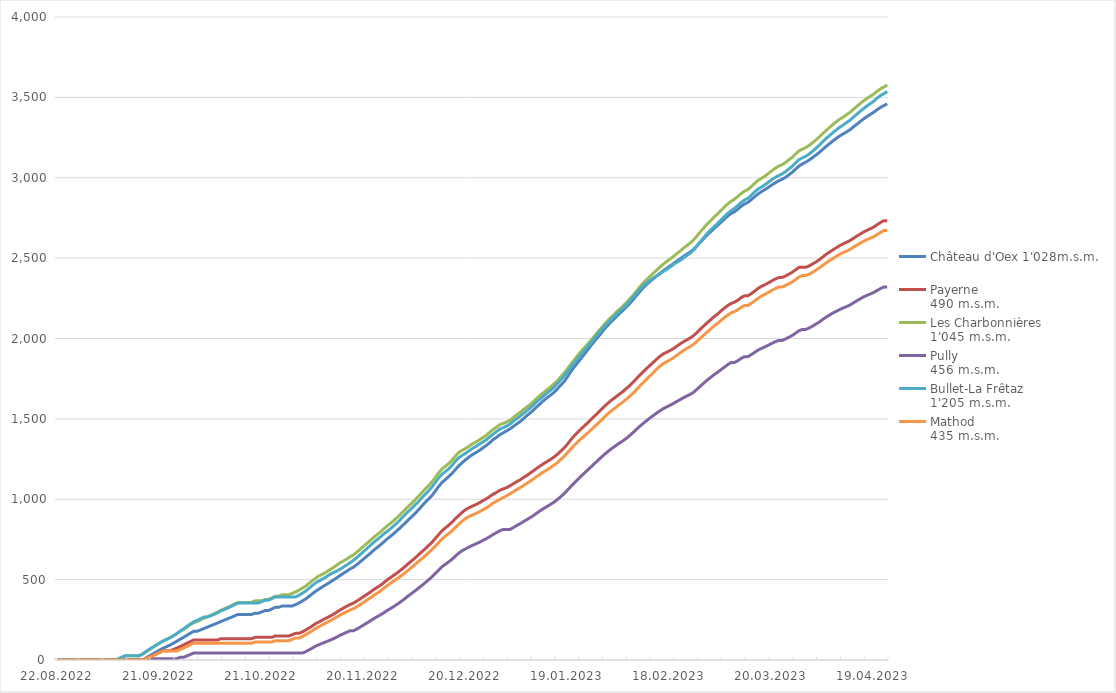
| Category | Château d'Oex 1'028m.s.m. | Payerne 
490 m.s.m. | Les Charbonnières 
1'045 m.s.m. | Pully 
456 m.s.m. | Bullet-La Frêtaz 
1'205 m.s.m. | Mathod 
435 m.s.m. |
|---|---|---|---|---|---|---|
| 22.08.2022 | 0 | 0 | 0 | 0 | 0 | 0 |
| 23.08.2022 | 0 | 0 | 0 | 0 | 0 | 0 |
| 24.08.2022 | 0 | 0 | 0 | 0 | 0 | 0 |
| 25.08.2022 | 0 | 0 | 0 | 0 | 0 | 0 |
| 26.08.2022 | 0 | 0 | 0 | 0 | 0 | 0 |
| 27.08.2022 | 0 | 0 | 0 | 0 | 0 | 0 |
| 28.08.2022 | 0 | 0 | 0 | 0 | 0 | 0 |
| 29.08.2022 | 0 | 0 | 0 | 0 | 0 | 0 |
| 30.08.2022 | 0 | 0 | 0 | 0 | 0 | 0 |
| 31.08.2022 | 0 | 0 | 0 | 0 | 0 | 0 |
| 01.09.2022 | 0 | 0 | 0 | 0 | 0 | 0 |
| 02.09.2022 | 0 | 0 | 0 | 0 | 0 | 0 |
| 03.09.2022 | 0 | 0 | 0 | 0 | 0 | 0 |
| 04.09.2022 | 0 | 0 | 0 | 0 | 0 | 0 |
| 05.09.2022 | 0 | 0 | 0 | 0 | 0 | 0 |
| 06.09.2022 | 0 | 0 | 0 | 0 | 0 | 0 |
| 07.09.2022 | 0 | 0 | 0 | 0 | 0 | 0 |
| 08.09.2022 | 0 | 0 | 0 | 0 | 0 | 0 |
| 09.09.2022 | 0 | 0 | 8.3 | 0 | 8.8 | 0 |
| 10.09.2022 | 0 | 0 | 17.5 | 0 | 18.7 | 0 |
| 11.09.2022 | 0 | 0 | 26.4 | 0 | 27 | 0 |
| 12.09.2022 | 0 | 0 | 26.4 | 0 | 27 | 0 |
| 13.09.2022 | 0 | 0 | 26.4 | 0 | 27 | 0 |
| 14.09.2022 | 0 | 0 | 26.4 | 0 | 27 | 0 |
| 15.09.2022 | 0 | 0 | 26.4 | 0 | 27 | 0 |
| 16.09.2022 | 0 | 0 | 36.5 | 0 | 37.9 | 0 |
| 17.09.2022 | 13.1 | 9.8 | 51.7 | 8.3 | 53.3 | 9 |
| 18.09.2022 | 25.5 | 18.8 | 65.4 | 8.3 | 66.5 | 18 |
| 19.09.2022 | 37.2 | 27.6 | 79.4 | 8.3 | 79.7 | 26.8 |
| 20.09.2022 | 49.7 | 37.2 | 92.1 | 8.3 | 92.7 | 36.7 |
| 21.09.2022 | 62.1 | 47.2 | 105 | 8.3 | 105.8 | 46.1 |
| 22.09.2022 | 73.5 | 57.5 | 117.9 | 8.3 | 118.2 | 56 |
| 23.09.2022 | 82.7 | 57.5 | 128.2 | 8.3 | 127.7 | 56 |
| 24.09.2022 | 92.6 | 57.5 | 138.1 | 8.3 | 138.7 | 56 |
| 25.09.2022 | 104.3 | 65.6 | 150.1 | 8.3 | 151 | 56 |
| 26.09.2022 | 115.9 | 73.9 | 162.9 | 8.3 | 164.4 | 56 |
| 27.09.2022 | 129.2 | 83.7 | 177.3 | 16.4 | 179.8 | 65.4 |
| 28.09.2022 | 140.7 | 93.3 | 189.9 | 16.4 | 193.7 | 74.2 |
| 29.09.2022 | 153.9 | 104 | 204.2 | 25.3 | 208.7 | 84.2 |
| 30.09.2022 | 166.9 | 114.8 | 219.3 | 34.4 | 224.2 | 94.8 |
| 01.10.2022 | 178.1 | 124.2 | 231.8 | 43 | 237.2 | 104.1 |
| 02.10.2022 | 178.1 | 124.2 | 240 | 43 | 246.2 | 104.1 |
| 03.10.2022 | 187.1 | 124.2 | 249.8 | 43 | 257.1 | 104.1 |
| 04.10.2022 | 196 | 124.2 | 259.5 | 43 | 266.9 | 104.1 |
| 05.10.2022 | 204.4 | 124.2 | 269.1 | 43 | 266.9 | 104.1 |
| 06.10.2022 | 213.1 | 124.2 | 278.4 | 43 | 274.9 | 104.1 |
| 07.10.2022 | 221.6 | 124.2 | 287.5 | 43 | 283.7 | 104.1 |
| 08.10.2022 | 230.2 | 124.2 | 298.3 | 43 | 293.6 | 104.1 |
| 09.10.2022 | 239.5 | 132.6 | 309.2 | 43 | 305.6 | 104.1 |
| 10.10.2022 | 248 | 132.6 | 318.3 | 43 | 314.3 | 104.1 |
| 11.10.2022 | 256.9 | 132.6 | 327.6 | 43 | 323.2 | 104.1 |
| 12.10.2022 | 265 | 132.6 | 337.5 | 43 | 333.5 | 104.1 |
| 13.10.2022 | 274.9 | 132.6 | 348.5 | 43 | 343.8 | 104.1 |
| 14.10.2022 | 283 | 132.6 | 357.9 | 43 | 354 | 104.1 |
| 15.10.2022 | 283 | 132.6 | 357.9 | 43 | 354 | 104.1 |
| 16.10.2022 | 283 | 132.6 | 357.9 | 43 | 354 | 104.1 |
| 17.10.2022 | 283 | 132.6 | 357.9 | 43 | 354 | 104.1 |
| 18.10.2022 | 283 | 132.6 | 357.9 | 43 | 354 | 104.1 |
| 19.10.2022 | 291.2 | 140.9 | 367.9 | 43 | 354 | 112.2 |
| 20.10.2022 | 291.2 | 140.9 | 367.9 | 43 | 354 | 112.2 |
| 21.10.2022 | 299.3 | 140.9 | 367.9 | 43 | 363 | 112.2 |
| 22.10.2022 | 307.8 | 140.9 | 376.6 | 43 | 372.1 | 112.2 |
| 23.10.2022 | 307.8 | 140.9 | 376.6 | 43 | 372.1 | 112.2 |
| 24.10.2022 | 317.3 | 140.9 | 385.9 | 43 | 382.2 | 112.2 |
| 25.10.2022 | 327.8 | 149.7 | 397 | 43 | 392.6 | 120.3 |
| 26.10.2022 | 327.8 | 149.7 | 397 | 43 | 392.6 | 120.3 |
| 27.10.2022 | 336 | 149.7 | 405.4 | 43 | 392.6 | 120.3 |
| 28.10.2022 | 336 | 149.7 | 405.4 | 43 | 392.6 | 120.3 |
| 29.10.2022 | 336 | 149.7 | 405.4 | 43 | 392.6 | 120.3 |
| 30.10.2022 | 336 | 157.8 | 414.9 | 43 | 392.6 | 129 |
| 31.10.2022 | 345.1 | 166 | 424.2 | 43 | 392.6 | 137.6 |
| 01.11.2022 | 354.9 | 166 | 434.9 | 43 | 403.3 | 137.6 |
| 02.11.2022 | 367.6 | 175.2 | 447.9 | 43 | 416.2 | 146.1 |
| 03.11.2022 | 380.7 | 187.3 | 460.9 | 52.4 | 429.8 | 158.2 |
| 04.11.2022 | 396.9 | 199.9 | 478.1 | 63.6 | 447.6 | 170.6 |
| 05.11.2022 | 413.8 | 213.3 | 495.7 | 75.6 | 465.8 | 183.7 |
| 06.11.2022 | 429.5 | 228.2 | 511.3 | 87.5 | 481.6 | 198 |
| 07.11.2022 | 443.6 | 238.3 | 524.8 | 96.6 | 494.3 | 209 |
| 08.11.2022 | 457.1 | 250.3 | 535.1 | 105.5 | 505.1 | 221.3 |
| 09.11.2022 | 470.1 | 260.8 | 546.9 | 114 | 517.8 | 231.3 |
| 10.11.2022 | 482.8 | 271.6 | 561 | 122.2 | 531.6 | 242.3 |
| 11.11.2022 | 496.8 | 283.6 | 574.2 | 131.5 | 543.1 | 254.3 |
| 12.11.2022 | 510 | 296.5 | 589 | 142 | 552.5 | 266.4 |
| 13.11.2022 | 524.7 | 310.5 | 604 | 153.6 | 564.1 | 279.2 |
| 14.11.2022 | 538.9 | 322.5 | 615.6 | 162.7 | 577.5 | 289.7 |
| 15.11.2022 | 552.2 | 334.3 | 628 | 172.5 | 591.6 | 300.6 |
| 16.11.2022 | 566.1 | 344.9 | 641.6 | 181.8 | 605.9 | 311.1 |
| 17.11.2022 | 577.6 | 354.1 | 654.4 | 181.8 | 619.7 | 319.4 |
| 18.11.2022 | 593.4 | 366.7 | 671.3 | 192.7 | 637.3 | 331.1 |
| 19.11.2022 | 611.4 | 380.8 | 689.6 | 205.3 | 656.1 | 344.9 |
| 20.11.2022 | 629.5 | 395.1 | 708.7 | 218 | 675.5 | 359.7 |
| 21.11.2022 | 646.2 | 408.9 | 726.4 | 230.9 | 694.1 | 373.3 |
| 22.11.2022 | 664.5 | 423 | 745.3 | 243.9 | 713.7 | 387.3 |
| 23.11.2022 | 684.1 | 438.7 | 763.7 | 258 | 732.7 | 403.1 |
| 24.11.2022 | 700.9 | 452 | 781.1 | 269.9 | 750.2 | 416.1 |
| 25.11.2022 | 717.8 | 465.9 | 798.4 | 281.9 | 767 | 430.3 |
| 26.11.2022 | 736.3 | 482.8 | 817.8 | 294.8 | 785.5 | 447.5 |
| 27.11.2022 | 755.1 | 499.6 | 836.1 | 309.2 | 802.1 | 464.1 |
| 28.11.2022 | 771.4 | 514.4 | 852.1 | 321.6 | 818.9 | 479.1 |
| 29.11.2022 | 789.5 | 529.4 | 870.6 | 334.9 | 837.5 | 493.8 |
| 30.11.2022 | 808.1 | 544.3 | 889.2 | 348.6 | 856.7 | 507.5 |
| 01.12.2022 | 827.9 | 561 | 910.3 | 364.2 | 878.5 | 523.3 |
| 02.12.2022 | 848 | 578 | 931.1 | 379.6 | 900.3 | 539.4 |
| 03.12.2022 | 868.9 | 597.2 | 953.1 | 397 | 921.6 | 557.2 |
| 04.12.2022 | 888.8 | 615 | 972.9 | 412.9 | 940.5 | 574 |
| 05.12.2022 | 909.1 | 632.5 | 993.9 | 428.5 | 961.8 | 592.2 |
| 06.12.2022 | 931.6 | 652.4 | 1015.9 | 445 | 982.6 | 610.8 |
| 07.12.2022 | 955.1 | 671.5 | 1038.7 | 462 | 1006.2 | 628.6 |
| 08.12.2022 | 978.7 | 690.3 | 1061.6 | 478.8 | 1029.3 | 646.8 |
| 09.12.2022 | 999.4 | 710.3 | 1082.5 | 497.3 | 1050.4 | 666.3 |
| 10.12.2022 | 1021 | 730.3 | 1106 | 515.5 | 1074.4 | 685.4 |
| 11.12.2022 | 1048.9 | 754.4 | 1134.2 | 536.5 | 1102.4 | 707.1 |
| 12.12.2022 | 1078.6 | 779 | 1162.7 | 558 | 1131 | 729.8 |
| 13.12.2022 | 1103.4 | 803.1 | 1188.4 | 579.4 | 1155.6 | 752.6 |
| 14.12.2022 | 1121.8 | 821.4 | 1204.3 | 595.5 | 1171.9 | 770.8 |
| 15.12.2022 | 1141 | 838.6 | 1222.7 | 610.2 | 1189.3 | 786.7 |
| 16.12.2022 | 1161.4 | 857.9 | 1243.5 | 626.9 | 1211 | 804.3 |
| 17.12.2022 | 1185 | 879.6 | 1269.3 | 647.1 | 1237.8 | 825 |
| 18.12.2022 | 1208.9 | 900.2 | 1292.5 | 665.4 | 1258.8 | 845.1 |
| 19.12.2022 | 1228.3 | 919.1 | 1305 | 680.4 | 1273.6 | 863.8 |
| 20.12.2022 | 1246.2 | 936.3 | 1316.5 | 691.7 | 1286.5 | 881.1 |
| 21.12.2022 | 1263.2 | 947.5 | 1330.2 | 702.8 | 1301.2 | 892.9 |
| 22.12.2022 | 1277.6 | 957.8 | 1344.4 | 713.2 | 1316.4 | 902.8 |
| 23.12.2022 | 1290.2 | 966.8 | 1355.9 | 722.7 | 1328.6 | 911.6 |
| 24.12.2022 | 1303.5 | 977.8 | 1369.3 | 732.1 | 1342.7 | 921.5 |
| 25.12.2022 | 1318.4 | 990.2 | 1383.3 | 743.5 | 1355.5 | 934 |
| 26.12.2022 | 1333.7 | 1002.2 | 1397.2 | 754.3 | 1369.8 | 945.6 |
| 27.12.2022 | 1350.7 | 1015.8 | 1415.7 | 766.2 | 1387.8 | 958.9 |
| 28.12.2022 | 1369.8 | 1030.7 | 1432.7 | 779.7 | 1404 | 975.3 |
| 29.12.2022 | 1384.3 | 1042.2 | 1447.8 | 791.4 | 1419.8 | 986.7 |
| 30.12.2022 | 1400.5 | 1055.2 | 1463.1 | 803.6 | 1436.1 | 998.8 |
| 31.12.2022 | 1413.1 | 1063.9 | 1471.5 | 812 | 1445.2 | 1010 |
| 01.01.2023 | 1424.6 | 1072 | 1480.1 | 812 | 1454.9 | 1021.1 |
| 02.01.2023 | 1437.2 | 1083.2 | 1490.8 | 812 | 1467.6 | 1033.3 |
| 03.01.2023 | 1452.4 | 1096.3 | 1507.7 | 824 | 1484.9 | 1046.5 |
| 04.01.2023 | 1468.6 | 1109.3 | 1525.4 | 836.3 | 1501.6 | 1059.9 |
| 05.01.2023 | 1483.2 | 1120.8 | 1540 | 847.9 | 1516.7 | 1071.8 |
| 06.01.2023 | 1501.3 | 1135.1 | 1558.2 | 861 | 1534.1 | 1085.7 |
| 07.01.2023 | 1520.4 | 1148.3 | 1574.3 | 873.5 | 1550.7 | 1099.2 |
| 08.01.2023 | 1537.6 | 1162.8 | 1589.6 | 886 | 1567.7 | 1112.8 |
| 09.01.2023 | 1556.4 | 1178.1 | 1609.2 | 900 | 1588 | 1127.5 |
| 10.01.2023 | 1576.8 | 1194 | 1629.5 | 915.1 | 1608.7 | 1142.8 |
| 11.01.2023 | 1596 | 1208.4 | 1647.3 | 929.6 | 1625.9 | 1157.6 |
| 12.01.2023 | 1615.5 | 1222.4 | 1665 | 943.4 | 1643.8 | 1171.5 |
| 13.01.2023 | 1632.3 | 1235.4 | 1682.4 | 955.8 | 1662 | 1184.3 |
| 14.01.2023 | 1648.2 | 1248.2 | 1699.3 | 968.8 | 1678.1 | 1197.8 |
| 15.01.2023 | 1665.6 | 1262.8 | 1718.2 | 982.6 | 1697.7 | 1212 |
| 16.01.2023 | 1687.9 | 1280.4 | 1739.3 | 998.8 | 1719.8 | 1229.2 |
| 17.01.2023 | 1710.1 | 1300.1 | 1761.7 | 1017 | 1743 | 1248.2 |
| 18.01.2023 | 1733.3 | 1319.9 | 1785.9 | 1036.1 | 1768 | 1267.6 |
| 19.01.2023 | 1764.3 | 1345 | 1813.9 | 1058.3 | 1795.7 | 1291.5 |
| 20.01.2023 | 1796.1 | 1371.8 | 1842.7 | 1081.2 | 1823.4 | 1315 |
| 21.01.2023 | 1825.1 | 1396.4 | 1869.7 | 1103.2 | 1850.5 | 1336.8 |
| 22.01.2023 | 1851.8 | 1417.7 | 1895.6 | 1123.8 | 1877.3 | 1357.2 |
| 23.01.2023 | 1878 | 1438.7 | 1921 | 1144.4 | 1903.3 | 1377.3 |
| 24.01.2023 | 1905.7 | 1458.1 | 1944.5 | 1164.5 | 1927.4 | 1395.9 |
| 25.01.2023 | 1932.6 | 1478.1 | 1968.3 | 1184.2 | 1951.8 | 1414.9 |
| 26.01.2023 | 1960 | 1498.7 | 1993.1 | 1204.2 | 1977.6 | 1434.6 |
| 27.01.2023 | 1986.4 | 1519.5 | 2018.6 | 1224.2 | 2003.7 | 1454.6 |
| 28.01.2023 | 2011.6 | 1539.8 | 2043.7 | 1243.8 | 2029.5 | 1473.9 |
| 29.01.2023 | 2038 | 1560.7 | 2068.7 | 1263.7 | 2055.7 | 1494 |
| 30.01.2023 | 2063.4 | 1581.7 | 2093.6 | 1282.6 | 2079.3 | 1515.7 |
| 31.01.2023 | 2086.4 | 1600.9 | 2116 | 1299.8 | 2101.6 | 1535.6 |
| 01.02.2023 | 2108.4 | 1618.1 | 2137.3 | 1316.4 | 2123.2 | 1552.7 |
| 02.02.2023 | 2128.9 | 1634 | 2157.5 | 1331.3 | 2144 | 1568.8 |
| 03.02.2023 | 2150.8 | 1650.6 | 2177.6 | 1346.6 | 2164.1 | 1585.5 |
| 04.02.2023 | 2170.3 | 1666.2 | 2195.8 | 1359.8 | 2182.8 | 1600.9 |
| 05.02.2023 | 2190.9 | 1684.7 | 2217.6 | 1375 | 2203.8 | 1618.8 |
| 06.02.2023 | 2212.1 | 1702.5 | 2239.9 | 1391.7 | 2226.9 | 1635.8 |
| 07.02.2023 | 2235.6 | 1722.8 | 2263.6 | 1410.3 | 2251.1 | 1655.5 |
| 08.02.2023 | 2261.6 | 1745 | 2289.3 | 1430.4 | 2277.4 | 1676.7 |
| 09.02.2023 | 2286.5 | 1767.4 | 2315.1 | 1449.8 | 2301.3 | 1699.4 |
| 10.02.2023 | 2310.9 | 1789 | 2340.6 | 1468 | 2324.3 | 1721.7 |
| 11.02.2023 | 2332.5 | 1809.6 | 2362.8 | 1485.7 | 2341.9 | 1742.9 |
| 12.02.2023 | 2351.6 | 1829.1 | 2382.4 | 1502 | 2359 | 1763.2 |
| 13.02.2023 | 2368.9 | 1848.4 | 2402.4 | 1518.1 | 2373.4 | 1784 |
| 14.02.2023 | 2386.3 | 1868.3 | 2422.3 | 1533.6 | 2387.6 | 1805.8 |
| 15.02.2023 | 2403 | 1887 | 2441.5 | 1548.4 | 2400.6 | 1825.6 |
| 16.02.2023 | 2419.8 | 1902.9 | 2460.7 | 1562.1 | 2415 | 1842.5 |
| 17.02.2023 | 2434.8 | 1913.1 | 2477.1 | 1573.2 | 2429 | 1854.5 |
| 18.02.2023 | 2449.7 | 1923.9 | 2492.3 | 1583.8 | 2442.8 | 1865.6 |
| 19.02.2023 | 2464.5 | 1935.8 | 2508.5 | 1594.7 | 2458.6 | 1878.1 |
| 20.02.2023 | 2480.1 | 1951 | 2526.1 | 1606.9 | 2473 | 1894.3 |
| 21.02.2023 | 2494.5 | 1965.4 | 2542.8 | 1618.9 | 2485 | 1910.2 |
| 22.02.2023 | 2509.7 | 1979.1 | 2560.8 | 1631.1 | 2499.8 | 1925.1 |
| 23.02.2023 | 2523.9 | 1991.2 | 2577 | 1641.7 | 2515.4 | 1937.8 |
| 24.02.2023 | 2537.7 | 2003 | 2593.4 | 1652.3 | 2530.2 | 1949.9 |
| 25.02.2023 | 2554 | 2017 | 2612.5 | 1665 | 2549.7 | 1962.9 |
| 26.02.2023 | 2576.6 | 2037.1 | 2637.2 | 1684 | 2575.3 | 1981.8 |
| 27.02.2023 | 2599 | 2057.6 | 2662.6 | 1703.1 | 2601.3 | 2001.3 |
| 28.02.2023 | 2621.3 | 2077.8 | 2687.4 | 1722 | 2627.2 | 2020.7 |
| 01.03.2023 | 2642.9 | 2097.4 | 2711.8 | 1740.6 | 2652.4 | 2039.7 |
| 02.03.2023 | 2663.1 | 2115.7 | 2733.1 | 1757.4 | 2674.7 | 2057.6 |
| 03.03.2023 | 2683.7 | 2135.1 | 2754.1 | 1774.1 | 2694.9 | 2077.2 |
| 04.03.2023 | 2701.8 | 2150.5 | 2772.4 | 1788.4 | 2713.8 | 2092 |
| 05.03.2023 | 2721.6 | 2169.8 | 2793.9 | 1804.7 | 2734.7 | 2110.8 |
| 06.03.2023 | 2741 | 2187.5 | 2815.7 | 1820.5 | 2756 | 2129 |
| 07.03.2023 | 2760.8 | 2204 | 2836 | 1836.3 | 2777.2 | 2145.3 |
| 08.03.2023 | 2776.8 | 2217.4 | 2852.4 | 1850 | 2794.6 | 2158.7 |
| 09.03.2023 | 2788.1 | 2225.6 | 2865.8 | 1850 | 2808.4 | 2166.8 |
| 10.03.2023 | 2803.8 | 2237.7 | 2883 | 1861.3 | 2826.4 | 2178.4 |
| 11.03.2023 | 2821.9 | 2254.3 | 2901.2 | 1876.2 | 2845.9 | 2194.3 |
| 12.03.2023 | 2836.8 | 2265.9 | 2916.6 | 1887 | 2861.5 | 2205.8 |
| 13.03.2023 | 2846.8 | 2265.9 | 2926.8 | 1887 | 2872.1 | 2205.8 |
| 14.03.2023 | 2863.9 | 2279.2 | 2944.7 | 1899.7 | 2890.8 | 2218.7 |
| 15.03.2023 | 2882.5 | 2295.2 | 2965.4 | 1913.9 | 2912.1 | 2234.1 |
| 16.03.2023 | 2899.6 | 2311.7 | 2983.7 | 1928 | 2929.8 | 2250.4 |
| 17.03.2023 | 2913.5 | 2324.6 | 2996.3 | 1938.5 | 2942.4 | 2264 |
| 18.03.2023 | 2926.3 | 2334.8 | 3009.9 | 1947.7 | 2955.9 | 2275.3 |
| 19.03.2023 | 2940.2 | 2345.8 | 3026.2 | 1958.1 | 2971.6 | 2286.6 |
| 20.03.2023 | 2954.5 | 2357.9 | 3042.8 | 1969 | 2987.9 | 2298.2 |
| 21.03.2023 | 2968.2 | 2369.7 | 3058.3 | 1979.4 | 3001.8 | 2310.4 |
| 22.03.2023 | 2980.1 | 2378.8 | 3071.6 | 1987.4 | 3013.1 | 2319.8 |
| 23.03.2023 | 2990.2 | 2378.8 | 3081 | 1987.4 | 3023.3 | 2319.8 |
| 24.03.2023 | 3001.7 | 2388.1 | 3093.8 | 1996.4 | 3037 | 2329.1 |
| 25.03.2023 | 3017.1 | 2399.6 | 3110.7 | 2006.9 | 3053.9 | 2340.1 |
| 26.03.2023 | 3033.7 | 2411.8 | 3126.8 | 2018.7 | 3070.5 | 2351.6 |
| 27.03.2023 | 3053.1 | 2427 | 3147.2 | 2033 | 3091.8 | 2366.2 |
| 28.03.2023 | 3072.1 | 2442.7 | 3166.8 | 2048.1 | 3112.3 | 2382.1 |
| 29.03.2023 | 3085.2 | 2442.7 | 3177.7 | 2056.3 | 3123 | 2391.6 |
| 30.03.2023 | 3096.8 | 2442.7 | 3187.6 | 2056.3 | 3133.4 | 2391.6 |
| 31.03.2023 | 3109.7 | 2451.4 | 3200.7 | 2065 | 3147.3 | 2399.9 |
| 01.04.2023 | 3125.1 | 2463.3 | 3217.6 | 2076.7 | 3164.9 | 2411.8 |
| 02.04.2023 | 3140.9 | 2475.7 | 3235.1 | 2089.7 | 3182.8 | 2425 |
| 03.04.2023 | 3157.2 | 2490.3 | 3254.1 | 2102.9 | 3202.4 | 2439 |
| 04.04.2023 | 3176.2 | 2507 | 3274.7 | 2118.1 | 3223.7 | 2454.6 |
| 05.04.2023 | 3194.9 | 2523.6 | 3294.1 | 2132.9 | 3244.2 | 2470.5 |
| 06.04.2023 | 3211.7 | 2537.9 | 3312.8 | 2145.8 | 3262 | 2484.9 |
| 07.04.2023 | 3228.8 | 2551.5 | 3331.3 | 2158.3 | 3280.1 | 2497.6 |
| 08.04.2023 | 3245.2 | 2564.6 | 3348.4 | 2169.5 | 3297.4 | 2510.8 |
| 09.04.2023 | 3260.1 | 2577.8 | 3363.5 | 2180.3 | 3314.2 | 2523.5 |
| 10.04.2023 | 3272.5 | 2588.8 | 3377.6 | 2189.8 | 3327.6 | 2534.8 |
| 11.04.2023 | 3284.9 | 2598.5 | 3392 | 2198.4 | 3342.5 | 2543.5 |
| 12.04.2023 | 3298 | 2608.9 | 3406.5 | 2208.1 | 3357.2 | 2553.6 |
| 13.04.2023 | 3316 | 2623 | 3425.7 | 2221.2 | 3376.6 | 2567.3 |
| 14.04.2023 | 3332.2 | 2636.1 | 3443.2 | 2233.8 | 3394.4 | 2580.7 |
| 15.04.2023 | 3349.1 | 2649.3 | 3460.7 | 2246.4 | 3412.4 | 2592.9 |
| 16.04.2023 | 3365.8 | 2662.1 | 3477.9 | 2258.5 | 3430.1 | 2604.8 |
| 17.04.2023 | 3380.4 | 2673 | 3493.2 | 2268.1 | 3446.2 | 2615.4 |
| 18.04.2023 | 3394.1 | 2682.8 | 3506.8 | 2277.2 | 3460.9 | 2624.4 |
| 19.04.2023 | 3407 | 2693.2 | 3520.1 | 2286.3 | 3476 | 2633.4 |
| 20.04.2023 | 3423.3 | 2707.6 | 3538 | 2298.9 | 3495.2 | 2646.8 |
| 21.04.2023 | 3437.3 | 2721.6 | 3553.5 | 2310.7 | 3511.5 | 2660 |
| 22.04.2023 | 3448.8 | 2732.7 | 3564.7 | 2320.4 | 3523.5 | 2671.7 |
| 23.04.2023 | 3459 | 2732.7 | 3576.9 | 2320.4 | 3536.5 | 2671.7 |